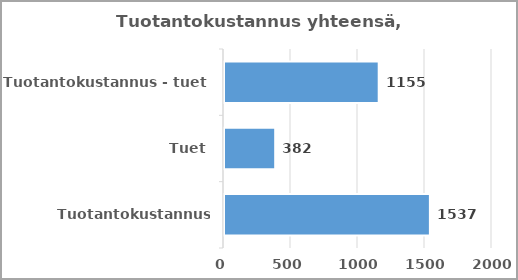
| Category | Series 0 |
|---|---|
| Tuotantokustannus yhteensä | 1536.532 |
| Tuet | 382 |
| Tuotantokustannus - tuet | 1154.532 |